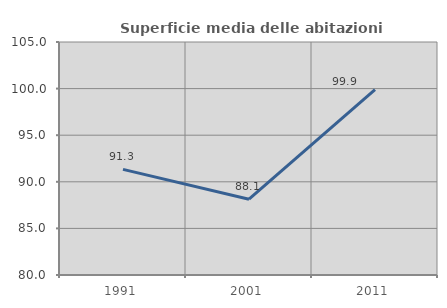
| Category | Superficie media delle abitazioni occupate |
|---|---|
| 1991.0 | 91.332 |
| 2001.0 | 88.135 |
| 2011.0 | 99.899 |